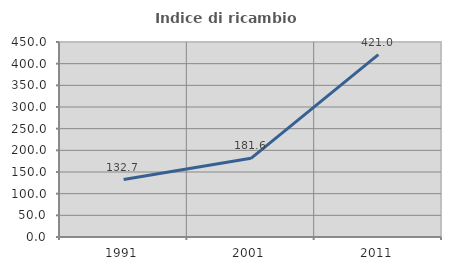
| Category | Indice di ricambio occupazionale  |
|---|---|
| 1991.0 | 132.673 |
| 2001.0 | 181.633 |
| 2011.0 | 420.968 |